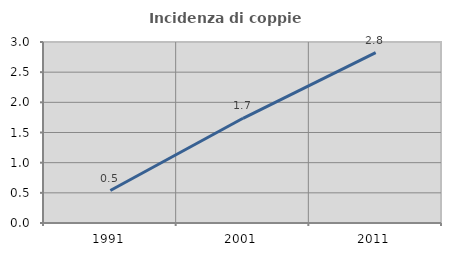
| Category | Incidenza di coppie miste |
|---|---|
| 1991.0 | 0.538 |
| 2001.0 | 1.735 |
| 2011.0 | 2.825 |